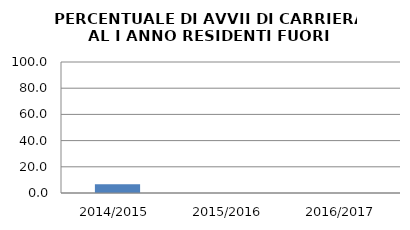
| Category | 2014/2015 2015/2016 2016/2017 |
|---|---|
| 2014/2015 | 6.667 |
| 2015/2016 | 0 |
| 2016/2017 | 0 |